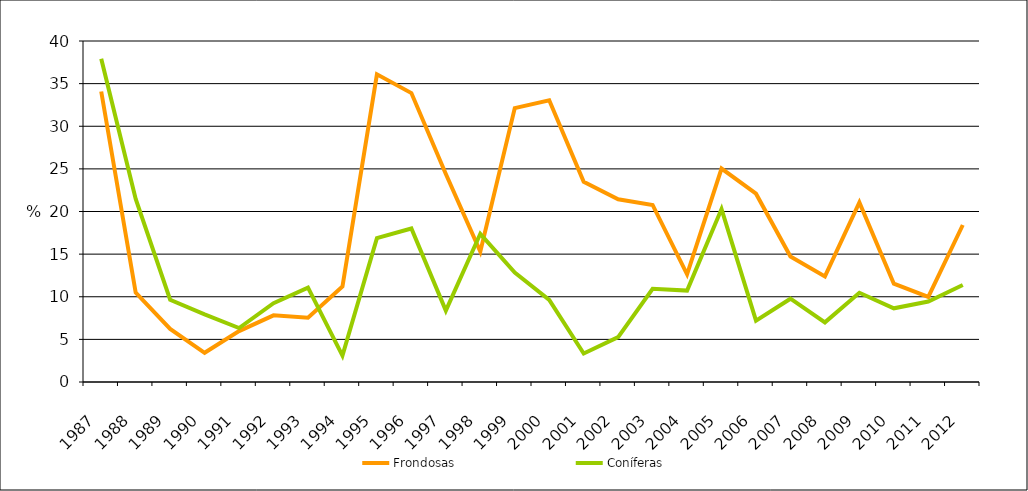
| Category | Frondosas | Coníferas |
|---|---|---|
| 1987.0 | 34.072 | 37.92 |
| 1988.0 | 10.494 | 21.477 |
| 1989.0 | 6.225 | 9.65 |
| 1990.0 | 3.425 | 7.927 |
| 1991.0 | 5.97 | 6.329 |
| 1992.0 | 7.818 | 9.242 |
| 1993.0 | 7.544 | 11.061 |
| 1994.0 | 11.201 | 3.105 |
| 1995.0 | 36.092 | 16.883 |
| 1996.0 | 33.894 | 18.006 |
| 1997.0 | 24.403 | 8.374 |
| 1998.0 | 15.289 | 17.384 |
| 1999.0 | 32.133 | 12.834 |
| 2000.0 | 33.045 | 9.639 |
| 2001.0 | 23.487 | 3.342 |
| 2002.0 | 21.439 | 5.263 |
| 2003.0 | 20.766 | 10.925 |
| 2004.0 | 12.628 | 10.724 |
| 2005.0 | 25.037 | 20.284 |
| 2006.0 | 22.091 | 7.198 |
| 2007.0 | 14.728 | 9.769 |
| 2008.0 | 12.39 | 6.995 |
| 2009.0 | 21.072 | 10.465 |
| 2010.0 | 11.536 | 8.645 |
| 2011.0 | 9.978 | 9.444 |
| 2012.0 | 18.415 | 11.384 |